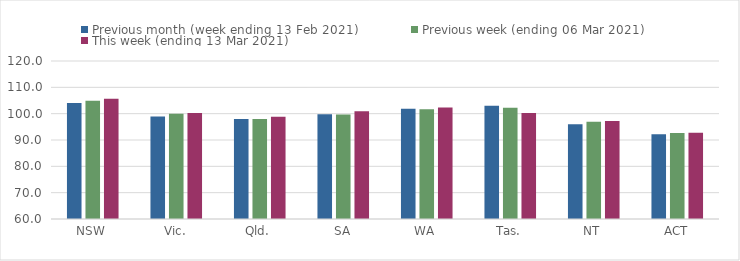
| Category | Previous month (week ending 13 Feb 2021) | Previous week (ending 06 Mar 2021) | This week (ending 13 Mar 2021) |
|---|---|---|---|
| NSW | 104.05 | 104.94 | 105.67 |
| Vic. | 98.91 | 99.94 | 100.28 |
| Qld. | 98.01 | 97.98 | 98.79 |
| SA | 99.74 | 99.69 | 100.95 |
| WA | 101.85 | 101.72 | 102.33 |
| Tas. | 103.05 | 102.25 | 100.3 |
| NT | 96.02 | 96.94 | 97.17 |
| ACT | 92.14 | 92.67 | 92.74 |